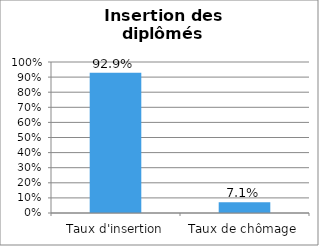
| Category | Promotion 2008 |
|---|---|
| Taux d'insertion | 0.929 |
| Taux de chômage | 0.071 |